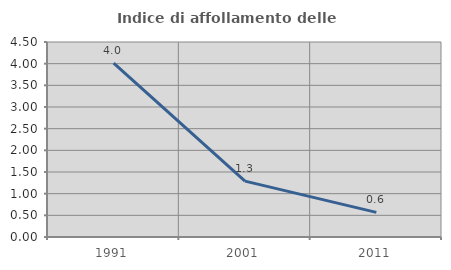
| Category | Indice di affollamento delle abitazioni  |
|---|---|
| 1991.0 | 4.013 |
| 2001.0 | 1.29 |
| 2011.0 | 0.567 |